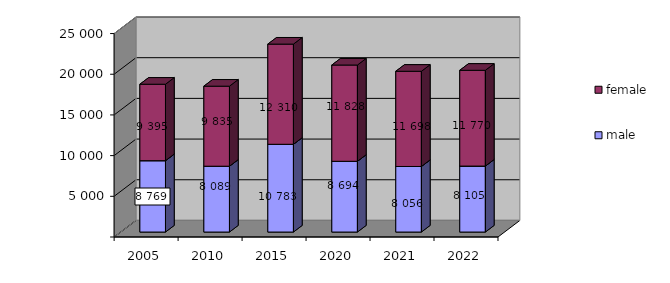
| Category | male | female |
|---|---|---|
| 2005.0 | 8769 | 9395 |
| 2010.0 | 8089 | 9835 |
| 2015.0 | 10783 | 12310 |
| 2020.0 | 8694 | 11828 |
| 2021.0 | 8056 | 11698 |
| 2022.0 | 8105 | 11770 |